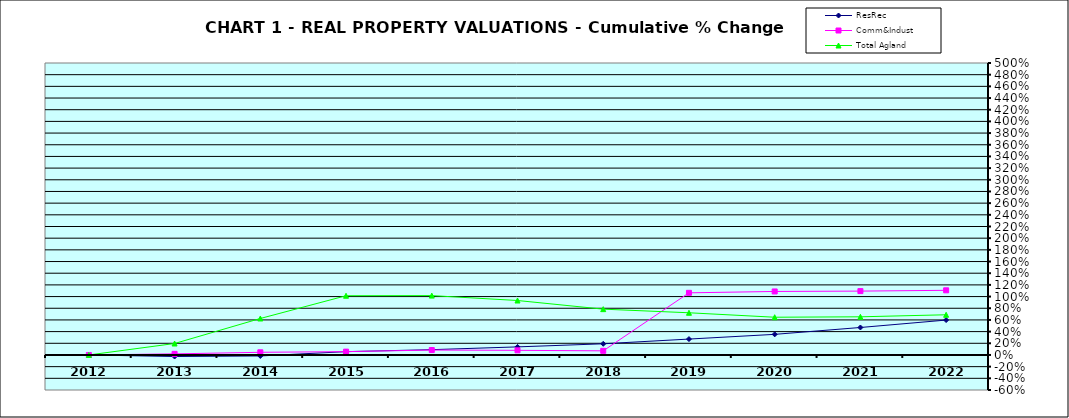
| Category | ResRec | Comm&Indust | Total Agland |
|---|---|---|---|
| 2012.0 | 0 | 0 | 0 |
| 2013.0 | -0.027 | 0.019 | 0.196 |
| 2014.0 | -0.017 | 0.046 | 0.625 |
| 2015.0 | 0.057 | 0.057 | 1.014 |
| 2016.0 | 0.091 | 0.084 | 1.016 |
| 2017.0 | 0.138 | 0.079 | 0.933 |
| 2018.0 | 0.191 | 0.071 | 0.785 |
| 2019.0 | 0.272 | 1.064 | 0.723 |
| 2020.0 | 0.353 | 1.088 | 0.646 |
| 2021.0 | 0.471 | 1.094 | 0.654 |
| 2022.0 | 0.598 | 1.107 | 0.688 |